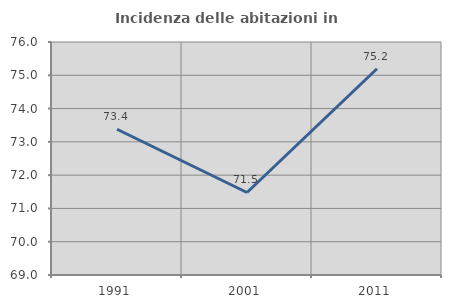
| Category | Incidenza delle abitazioni in proprietà  |
|---|---|
| 1991.0 | 73.379 |
| 2001.0 | 71.479 |
| 2011.0 | 75.197 |